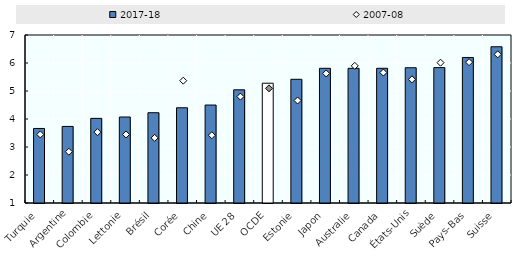
| Category | 2017-18 |
|---|---|
| Turquie | 3.662 |
| Argentine | 3.735 |
| Colombie | 4.023 |
| Lettonie | 4.071 |
| Brésil | 4.224 |
| Corée | 4.401 |
| Chine | 4.499 |
| UE 28 | 5.043 |
| OCDE | 5.278 |
| Estonie | 5.419 |
| Japon | 5.811 |
| Australie | 5.811 |
| Canada | 5.811 |
| États-Unis | 5.831 |
| Suède | 5.835 |
| Pays-Bas | 6.197 |
| Suisse | 6.58 |